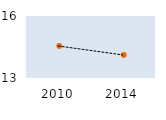
| Category | Max | OECD mean | Min |
|---|---|---|---|
| 2010.0 | 39.606 | 14.55 | 0.992 |
| 2014.0 | 36.653 | 14.117 | 3.299 |